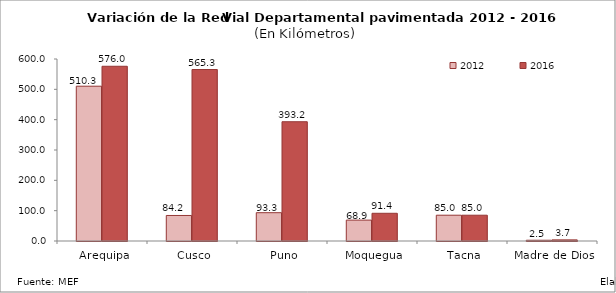
| Category | 2012 | 2016 |
|---|---|---|
|  Arequipa | 510.31 | 576.013 |
|  Cusco | 84.16 | 565.33 |
|  Puno | 93.32 | 393.208 |
|  Moquegua | 68.85 | 91.377 |
|  Tacna | 85 | 85.002 |
|  Madre de Dios | 2.49 | 3.673 |